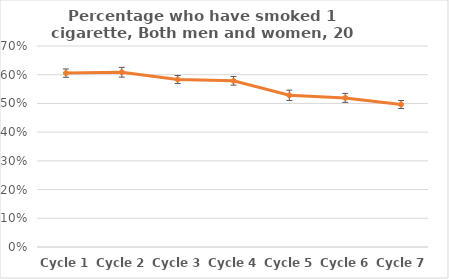
| Category | Percentage of population who smoked 1 cigarette |
|---|---|
| Cycle 1 | 0.606 |
| Cycle 2 | 0.609 |
| Cycle 3 | 0.583 |
| Cycle 4 | 0.579 |
| Cycle 5 | 0.528 |
| Cycle 6 | 0.519 |
| Cycle 7 | 0.496 |